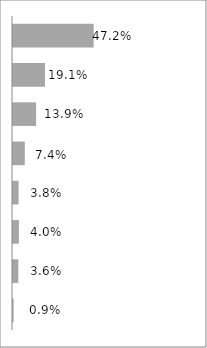
| Category | Series 0 |
|---|---|
| Excel School - Dashboards Membership | 0.472 |
| PM Templates for Excel [2007] | 0.191 |
| Excel School - Download Membership | 0.139 |
| Dashboard Tutorial #1 | 0.074 |
| PM Templates for Excel [both] | 0.038 |
| PM Templates for Excel [2003] | 0.04 |
| Excel School - Online Membership | 0.036 |
| Excel Formula e-book | 0.009 |